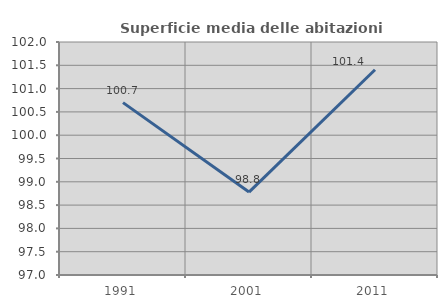
| Category | Superficie media delle abitazioni occupate |
|---|---|
| 1991.0 | 100.699 |
| 2001.0 | 98.78 |
| 2011.0 | 101.405 |